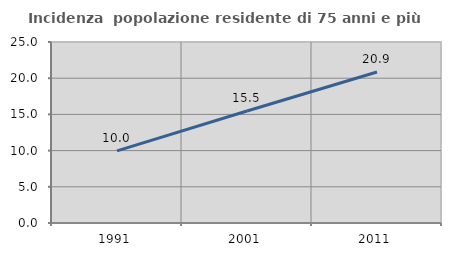
| Category | Incidenza  popolazione residente di 75 anni e più |
|---|---|
| 1991.0 | 9.955 |
| 2001.0 | 15.467 |
| 2011.0 | 20.858 |